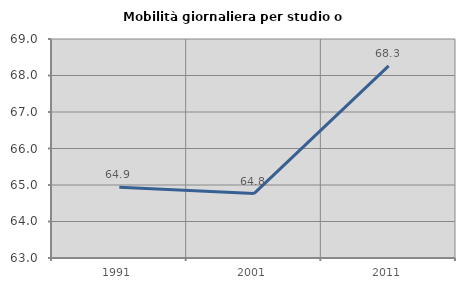
| Category | Mobilità giornaliera per studio o lavoro |
|---|---|
| 1991.0 | 64.941 |
| 2001.0 | 64.765 |
| 2011.0 | 68.264 |